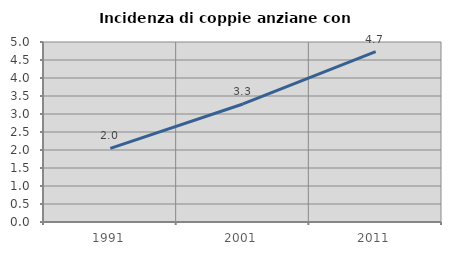
| Category | Incidenza di coppie anziane con figli |
|---|---|
| 1991.0 | 2.044 |
| 2001.0 | 3.279 |
| 2011.0 | 4.735 |